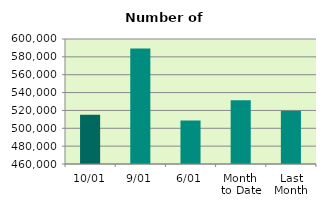
| Category | Series 0 |
|---|---|
| 10/01 | 515092 |
| 9/01 | 589224 |
| 6/01 | 508764 |
| Month 
to Date | 531319.143 |
| Last
Month | 519611.714 |